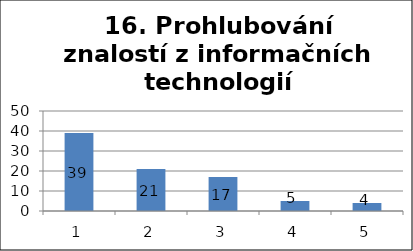
| Category | Series 1 |
|---|---|
| 0 | 39 |
| 1 | 21 |
| 2 | 17 |
| 3 | 5 |
| 4 | 4 |